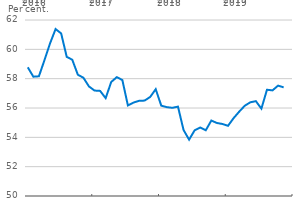
| Category | Foreign ownership share of C25 |
|---|---|
| 2016-01-01 | 58.775 |
| 2016-02-01 | 58.135 |
| 2016-03-01 | 58.161 |
| 2016-04-01 | 59.263 |
| 2016-05-01 | 60.404 |
| 2016-06-01 | 61.383 |
| 2016-07-01 | 61.084 |
| 2016-08-01 | 59.49 |
| 2016-09-01 | 59.29 |
| 2016-10-01 | 58.269 |
| 2016-11-01 | 58.064 |
| 2016-12-01 | 57.469 |
| 2017-01-01 | 57.19 |
| 2017-02-01 | 57.167 |
| 2017-03-01 | 56.672 |
| 2017-04-01 | 57.774 |
| 2017-05-01 | 58.104 |
| 2017-06-01 | 57.908 |
| 2017-07-01 | 56.172 |
| 2017-08-01 | 56.37 |
| 2017-09-01 | 56.489 |
| 2017-10-01 | 56.506 |
| 2017-11-01 | 56.752 |
| 2017-12-01 | 57.282 |
| 2018-01-01 | 56.158 |
| 2018-02-01 | 56.057 |
| 2018-03-01 | 56.012 |
| 2018-04-01 | 56.094 |
| 2018-05-01 | 54.504 |
| 2018-06-01 | 53.841 |
| 2018-07-01 | 54.481 |
| 2018-08-01 | 54.668 |
| 2018-09-01 | 54.481 |
| 2018-10-01 | 55.144 |
| 2018-11-01 | 54.978 |
| 2018-12-01 | 54.91 |
| 2019-01-01 | 54.786 |
| 2019-02-01 | 55.308 |
| 2019-03-01 | 55.747 |
| 2019-04-01 | 56.152 |
| 2019-05-01 | 56.387 |
| 2019-06-01 | 56.467 |
| 2019-07-01 | 55.957 |
| 2019-08-01 | 57.245 |
| 2019-09-01 | 57.202 |
| 2019-10-01 | 57.526 |
| 2019-11-01 | 57.406 |